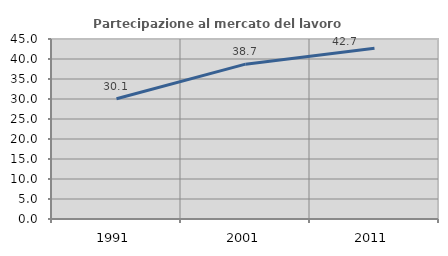
| Category | Partecipazione al mercato del lavoro  femminile |
|---|---|
| 1991.0 | 30.065 |
| 2001.0 | 38.71 |
| 2011.0 | 42.712 |